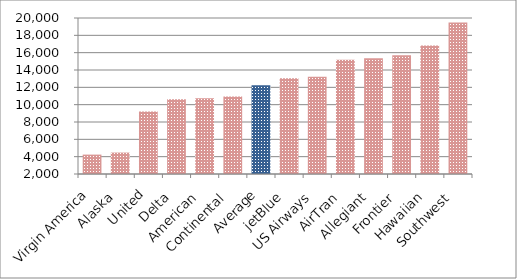
| Category | Series 0 |
|---|---|
| Virgin America | 4239 |
|  Alaska  | 4473 |
|  United  | 9199 |
|  Delta  | 10633 |
|  American  | 10730 |
|  Continental  | 10940 |
| Average | 12238 |
|  jetBlue  | 13050 |
|  US Airways  | 13230 |
|  AirTran  | 15194 |
|  Allegiant  | 15370 |
|  Frontier  | 15709 |
|  Hawaiian  | 16827 |
|  Southwest  | 19494 |